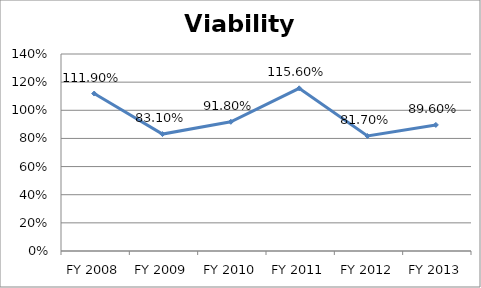
| Category | Viability ratio |
|---|---|
| FY 2013 | 0.896 |
| FY 2012 | 0.817 |
| FY 2011 | 1.156 |
| FY 2010 | 0.918 |
| FY 2009 | 0.831 |
| FY 2008 | 1.119 |